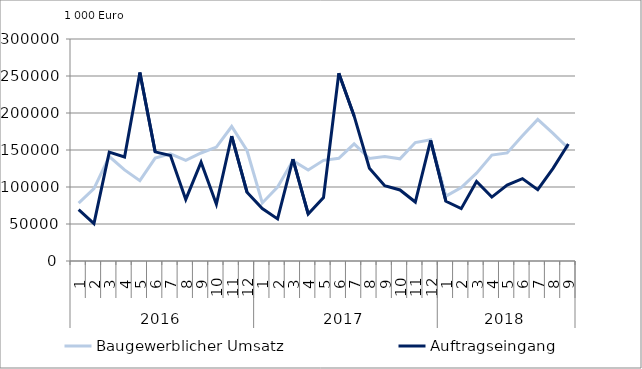
| Category | Baugewerblicher Umsatz | Auftragseingang |
|---|---|---|
| 0 | 78291.738 | 69470.357 |
| 1 | 97863.379 | 50640.033 |
| 2 | 141176.119 | 147206.65 |
| 3 | 123121.297 | 140579.009 |
| 4 | 108561.124 | 254739.334 |
| 5 | 139030.209 | 147481.644 |
| 6 | 144784.416 | 142609.658 |
| 7 | 135870.195 | 83192.156 |
| 8 | 145961.738 | 133594.351 |
| 9 | 153886.826 | 76793.838 |
| 10 | 181740.037 | 168867.568 |
| 11 | 149348.138 | 93011.853 |
| 12 | 78446.78 | 70908.903 |
| 13 | 99841.908 | 56868.408 |
| 14 | 135679.867 | 137790.423 |
| 15 | 123004.403 | 63637.761 |
| 16 | 136010.071 | 85644.63 |
| 17 | 138859.308 | 253791.552 |
| 18 | 158353.879 | 196034.198 |
| 19 | 138510.315 | 125319.873 |
| 20 | 141109.925 | 101690.626 |
| 21 | 138067.098 | 95966.626 |
| 22 | 160064.454 | 79701.993 |
| 23 | 163969.017 | 162878.607 |
| 24 | 87640.529 | 80684.627 |
| 25 | 99259.455 | 70746.763 |
| 26 | 118764.324 | 107538.747 |
| 27 | 143144.178 | 86374.619 |
| 28 | 146070.782 | 102661.329 |
| 29 | 169150.753 | 111287.709 |
| 30 | 191277.885 | 96286.662 |
| 31 | 172425.535 | 125142.495 |
| 32 | 152354.98 | 158112.302 |